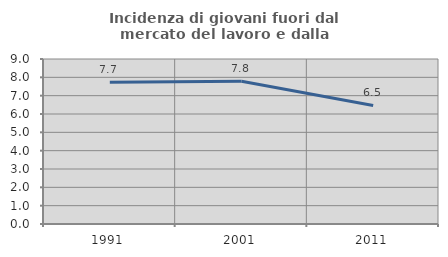
| Category | Incidenza di giovani fuori dal mercato del lavoro e dalla formazione  |
|---|---|
| 1991.0 | 7.728 |
| 2001.0 | 7.79 |
| 2011.0 | 6.467 |